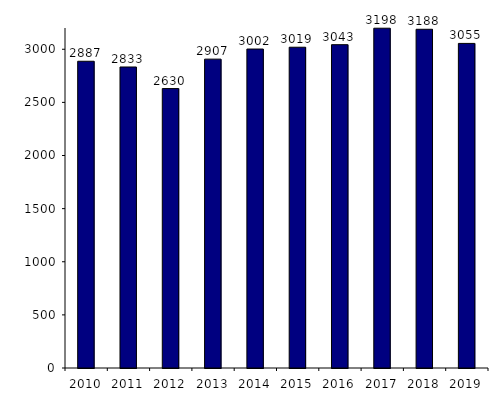
| Category | Nombre de patients autogreffés |
|---|---|
| 2010.0 | 2887 |
| 2011.0 | 2833 |
| 2012.0 | 2630 |
| 2013.0 | 2907 |
| 2014.0 | 3002 |
| 2015.0 | 3019 |
| 2016.0 | 3043 |
| 2017.0 | 3198 |
| 2018.0 | 3188 |
| 2019.0 | 3055 |